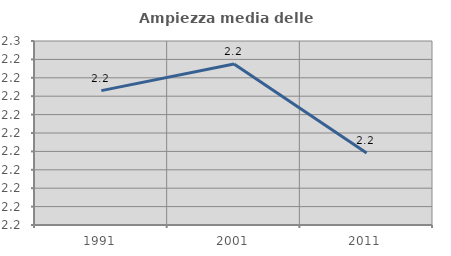
| Category | Ampiezza media delle famiglie |
|---|---|
| 1991.0 | 2.237 |
| 2001.0 | 2.244 |
| 2011.0 | 2.22 |